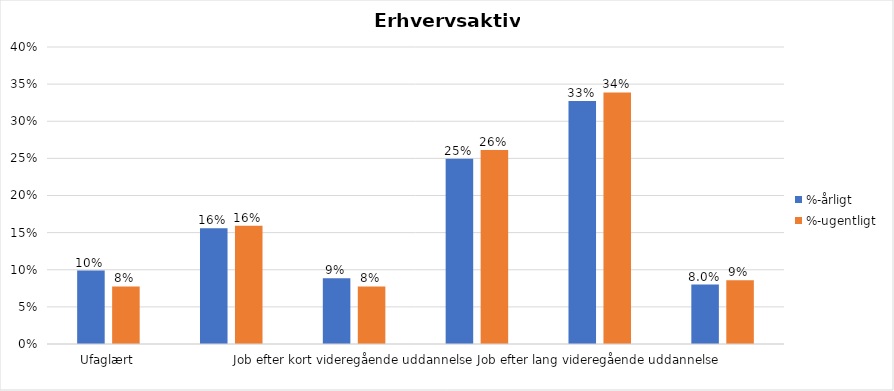
| Category | %-årligt | %-ugentligt |
|---|---|---|
| Ufaglært | 0.099 | 0.078 |
| Erhvervsfagligt job | 0.156 | 0.159 |
| Job efter kort videregående uddannelse | 0.088 | 0.078 |
| Job efter mellemlang videregående uddannelse | 0.249 | 0.261 |
| Job efter lang videregående uddannelse | 0.327 | 0.339 |
| Selvstændig | 0.08 | 0.086 |